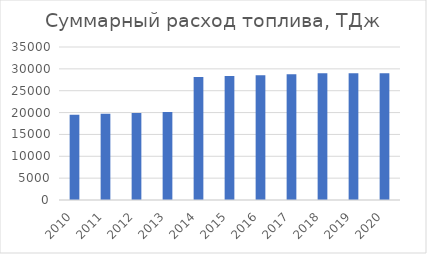
| Category | TДж |
|---|---|
| 2010.0 | 19525.278 |
| 2011.0 | 19722.503 |
| 2012.0 | 19921.72 |
| 2013.0 | 20122.949 |
| 2014.0 | 28145.034 |
| 2015.0 | 28350.35 |
| 2016.0 | 28557.739 |
| 2017.0 | 28767.223 |
| 2018.0 | 28978.823 |
| 2019.0 | 28978.823 |
| 2020.0 | 28978.823 |